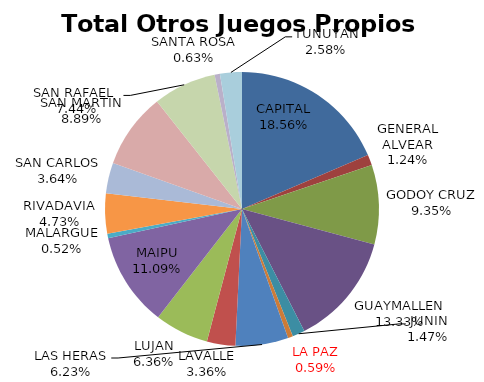
| Category | Total Otros Juegos Propios Beneficio |
|---|---|
| CAPITAL | 162638.05 |
| GENERAL ALVEAR | 10903.79 |
| GODOY CRUZ | 81960.59 |
| GUAYMALLEN | 116759.72 |
| JUNIN | 12890.48 |
| LA PAZ | -5175.9 |
| LAS HERAS | 54557.68 |
| LAVALLE | 29430.37 |
| LUJAN | 55737.69 |
| MAIPU | 97153.6 |
| MALARGUE | 4561.37 |
| RIVADAVIA | 41455.38 |
| SAN CARLOS | 31855.42 |
| SAN MARTIN | 77854.6 |
| SAN RAFAEL  | 65211.38 |
| SANTA ROSA | 5524.17 |
| TUNUYAN | 22593.72 |